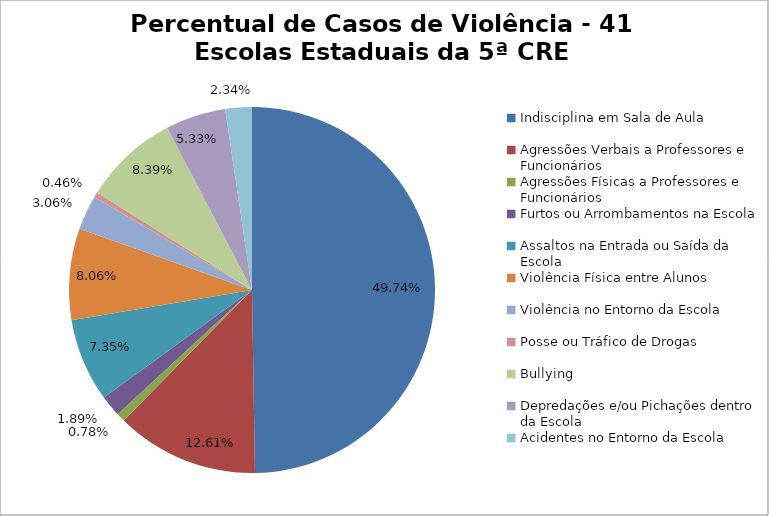
| Category | Percentual |
|---|---|
| Indisciplina em Sala de Aula | 0.497 |
| Agressões Verbais a Professores e Funcionários | 0.126 |
| Agressões Físicas a Professores e Funcionários | 0.008 |
| Furtos ou Arrombamentos na Escola | 0.019 |
| Assaltos na Entrada ou Saída da Escola | 0.073 |
| Violência Física entre Alunos | 0.081 |
| Violência no Entorno da Escola | 0.031 |
| Posse ou Tráfico de Drogas | 0.005 |
| Bullying | 0.084 |
| Depredações e/ou Pichações dentro da Escola | 0.053 |
| Acidentes no Entorno da Escola | 0.023 |